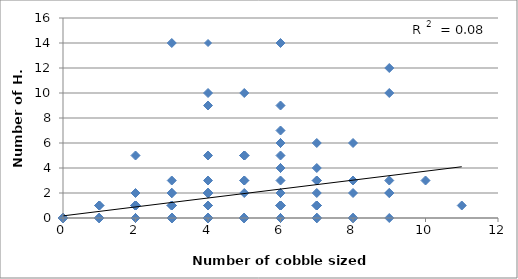
| Category | Crabs |
|---|---|
| 7.0 | 3 |
| 5.0 | 5 |
| 7.0 | 0 |
| 5.0 | 2 |
| 4.0 | 14 |
| 9.0 | 10 |
| 4.0 | 9 |
| 3.0 | 0 |
| 5.0 | 5 |
| 2.0 | 5 |
| 2.0 | 0 |
| 6.0 | 3 |
| 2.0 | 1 |
| 6.0 | 4 |
| 6.0 | 9 |
| 4.0 | 2 |
| 4.0 | 2 |
| 6.0 | 6 |
| 2.0 | 1 |
| 3.0 | 2 |
| 6.0 | 7 |
| 2.0 | 0 |
| 0.0 | 0 |
| 1.0 | 0 |
| 3.0 | 0 |
| 5.0 | 0 |
| 4.0 | 0 |
| 2.0 | 1 |
| 3.0 | 0 |
| 3.0 | 0 |
| 5.0 | 0 |
| 1.0 | 0 |
| 4.0 | 0 |
| 2.0 | 0 |
| 2.0 | 1 |
| 4.0 | 0 |
| 5.0 | 0 |
| 2.0 | 0 |
| 5.0 | 3 |
| 11.0 | 1 |
| 4.0 | 1 |
| 2.0 | 0 |
| 3.0 | 1 |
| 6.0 | 5 |
| 9.0 | 12 |
| 7.0 | 2 |
| 5.0 | 5 |
| 5.0 | 5 |
| 9.0 | 3 |
| 7.0 | 1 |
| 4.0 | 1 |
| 3.0 | 2 |
| 8.0 | 6 |
| 6.0 | 2 |
| 1.0 | 1 |
| 7.0 | 4 |
| 6.0 | 2 |
| 6.0 | 2 |
| 3.0 | 3 |
| 7.0 | 3 |
| 4.0 | 2 |
| 3.0 | 1 |
| 7.0 | 1 |
| 4.0 | 3 |
| 4.0 | 1 |
| 6.0 | 0 |
| 6.0 | 1 |
| 6.0 | 1 |
| 4.0 | 0 |
| 7.0 | 0 |
| 6.0 | 1 |
| 6.0 | 6 |
| 5.0 | 0 |
| 3.0 | 0 |
| 6.0 | 0 |
| 6.0 | 0 |
| 8.0 | 0 |
| 7.0 | 1 |
| 6.0 | 1 |
| 2.0 | 1 |
| 2.0 | 0 |
| 4.0 | 2 |
| 5.0 | 0 |
| 4.0 | 0 |
| 5.0 | 0 |
| 2.0 | 0 |
| 1.0 | 1 |
| 1.0 | 0 |
| 1.0 | 1 |
| 2.0 | 0 |
| 1.0 | 0 |
| 4.0 | 0 |
| 8.0 | 0 |
| 5.0 | 0 |
| 7.0 | 0 |
| 6.0 | 0 |
| 5.0 | 10 |
| 4.0 | 0 |
| 6.0 | 0 |
| 2.0 | 0 |
| 1.0 | 0 |
| 1.0 | 0 |
| 0.0 | 0 |
| 2.0 | 0 |
| 6.0 | 14 |
| 3.0 | 0 |
| 4.0 | 5 |
| 4.0 | 0 |
| 7.0 | 6 |
| 8.0 | 0 |
| 2.0 | 0 |
| 3.0 | 0 |
| 3.0 | 0 |
| 4.0 | 1 |
| 2.0 | 0 |
| 0.0 | 0 |
| 5.0 | 0 |
| 4.0 | 10 |
| 10.0 | 3 |
| 8.0 | 2 |
| 3.0 | 1 |
| 3.0 | 0 |
| 3.0 | 0 |
| 7.0 | 1 |
| 3.0 | 0 |
| 3.0 | 1 |
| 2.0 | 2 |
| 5.0 | 0 |
| 9.0 | 2 |
| 9.0 | 2 |
| 9.0 | 0 |
| 6.0 | 0 |
| 5.0 | 0 |
| 5.0 | 0 |
| 6.0 | 4 |
| 7.0 | 0 |
| 5.0 | 3 |
| 8.0 | 3 |
| 3.0 | 14 |
| 3.0 | 0 |
| 2.0 | 0 |
| 2.0 | 0 |
| 6.0 | 0 |
| 6.0 | 0 |
| 6.0 | 0 |
| 3.0 | 2 |
| 3.0 | 0 |
| 4.0 | 1 |
| 1.0 | 0 |
| 0.0 | 0 |
| 2.0 | 0 |
| 2.0 | 0 |
| 4.0 | 0 |
| 3.0 | 0 |
| 0.0 | 0 |